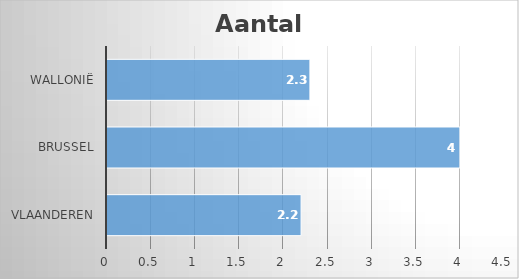
| Category | Aantal |
|---|---|
| Vlaanderen | 2.2 |
| Brussel | 4 |
| Wallonië | 2.3 |